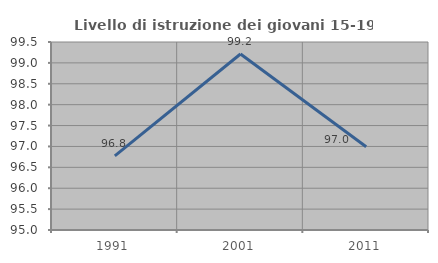
| Category | Livello di istruzione dei giovani 15-19 anni |
|---|---|
| 1991.0 | 96.774 |
| 2001.0 | 99.213 |
| 2011.0 | 96.992 |